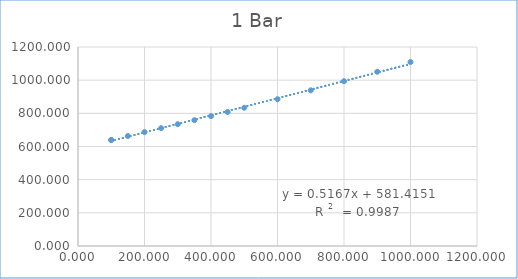
| Category | Series 0 |
|---|---|
| 99.6 | 639.011 |
| 100.0 | 639.226 |
| 150.0 | 663.306 |
| 200.0 | 686.933 |
| 250.0 | 710.583 |
| 300.0 | 734.472 |
| 350.0 | 758.672 |
| 400.0 | 783.23 |
| 450.0 | 808.122 |
| 500.0 | 833.421 |
| 600.0 | 885.237 |
| 700.0 | 938.7 |
| 800.0 | 993.837 |
| 900.0 | 1050.645 |
| 1000.0 | 1109.078 |